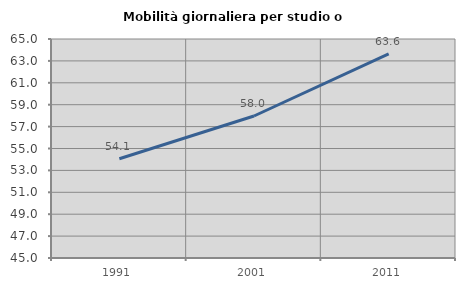
| Category | Mobilità giornaliera per studio o lavoro |
|---|---|
| 1991.0 | 54.068 |
| 2001.0 | 57.968 |
| 2011.0 | 63.633 |